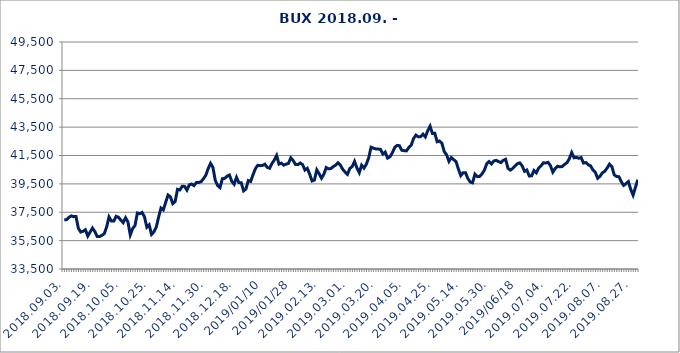
| Category | Series 0 |
|---|---|
| 2018.09.03. | 36971.856 |
| 2018.09.04. | 36968.107 |
| 2018.09.05. | 37135.328 |
| 2018.09.06. | 37241.816 |
| 2018.09.07. | 37189.976 |
| 2018.09.10. | 37202.889 |
| 2018.09.11. | 36371.943 |
| 2018.09.12. | 36104.073 |
| 2018.09.13. | 36156.035 |
| 2018.09.14. | 36269.166 |
| 2018.09.17. | 35819.9 |
| 2018.09.18. | 36110.885 |
| 2018.09.19. | 36386.403 |
| 2018.09.20. | 36134.329 |
| 2018.09.21. | 35783.48 |
| 2018.09.24. | 35786.545 |
| 2018.09.25. | 35868.88 |
| 2018.09.26. | 35996.041 |
| 2018.09.27. | 36471.348 |
| 2018.09.28. | 37171.414 |
| 2018.10.01. | 36883.492 |
| 2018.10.02. | 36876.748 |
| 2018.10.03. | 37212.945 |
| 2018.10.04. | 37146.727 |
| 2018.10.05. | 36945.25 |
| 2018.10.08. | 36768.023 |
| 2018.10.09. | 37109.241 |
| 2018.10.10. | 36821.117 |
| 2018.10.11. | 35904.542 |
| 2018.10.12. | 36347.89 |
| 2018.10.15. | 36564.15 |
| 2018.10.16. | 37445.673 |
| 2018.10.17. | 37399.11 |
| 2018.10.18. | 37485.015 |
| 2018.10.19. | 37185.929 |
| 2018.10.24. | 36452.736 |
| 2018.10.25. | 36617.542 |
| 2018.10.26. | 35937.614 |
| 2018.10.29. | 36110.122 |
| 2018.10.30. | 36444.725 |
| 2018.10.31. | 37155.206 |
| 2018.11.05. | 37794.87 |
| 2018.11.06. | 37666.001 |
| 2018.11.07. | 38197.997 |
| 2018.11.08. | 38713.446 |
| 2018.11.09. | 38586.627 |
| 2018.11.12. | 38108.455 |
| 2018.11.13. | 38252.647 |
| 2018.11.14. | 39115.558 |
| 2018.11.15. | 39070.967 |
| 2018.11.16. | 39328.386 |
| 2018.11.19. | 39323.012 |
| 2018.11.20. | 39058.304 |
| 2018.11.21. | 39431.33 |
| 2018.11.22. | 39489.376 |
| 2018.11.23. | 39379.776 |
| 2018.11.26. | 39598.286 |
| 2018.11.27. | 39601.698 |
| 2018.11.28. | 39656.246 |
| 2018.11.29. | 39861.634 |
| 2018.11.30. | 40109.366 |
| 2018.12.03. | 40579.822 |
| 2018.12.04. | 40945.474 |
| 2018.12.05. | 40670.445 |
| 2018.12.06. | 39747.127 |
| 2018.12.07. | 39384.556 |
| 2018.12.10. | 39238.436 |
| 2018.12.11. | 39860.234 |
| 2018.12.12. | 39887.22 |
| 2018.12.13. | 40041.705 |
| 2018.12.14. | 40125.722 |
| 2018.12.17. | 39675.759 |
| 2018.12.18. | 39475.607 |
| 2018.12.19. | 39966.192 |
| 2018.12.20. | 39592.675 |
| 2018.12.21. | 39578.632 |
| 2018.12.27. | 39006.517 |
| 2018.12.28. | 39138.949 |
| 2019.01.02 | 39734.064 |
| 2019.01.03 | 39672.597 |
| 2019.01.04 | 40145.177 |
| 2019.01.07 | 40569.468 |
| 2019.01.08 | 40809.819 |
| 2019.01.09 | 40784.268 |
| 2019.01.10 | 40795.505 |
| 2019.01.11 | 40886.064 |
| 2019.01.14 | 40667.654 |
| 2019.01.15 | 40600.26 |
| 2019.01.16 | 40933.043 |
| 2019.01.17 | 41180.049 |
| 2019.01.18 | 41503.905 |
| 2019.01.21 | 40893.713 |
| 2019.01.22 | 40963.712 |
| 2019.01.23 | 40818.686 |
| 2019.01.24 | 40890.939 |
| 2019.01.25 | 40944.824 |
| 2019.01.28 | 41332.315 |
| 2019.01.29 | 41146 |
| 2019.01.30 | 40862.967 |
| 2019.01.31 | 40855.561 |
| 2019.02.01. | 40973.34 |
| 2019.02.04. | 40856.968 |
| 2019.02.05. | 40474.394 |
| 2019.02.06. | 40597.263 |
| 2019.02.07. | 40173.726 |
| 2019.02.08. | 39704.61 |
| 2019.02.11. | 39769.479 |
| 2019.02.12. | 40488.09 |
| 2019.02.13. | 40221.18 |
| 2019.02.14. | 39898.653 |
| 2019.02.15. | 40179.836 |
| 2019.02.18. | 40653.387 |
| 2019.02.19. | 40560.444 |
| 2019.02.20. | 40582.832 |
| 2019.02.21. | 40721.477 |
| 2019.02.22. | 40814.595 |
| 2019.02.25. | 40987.946 |
| 2019.02.26. | 40819.081 |
| 2019.02.27. | 40525.284 |
| 2019.02.28. | 40333.039 |
| 2019.03.01. | 40170.655 |
| 2019.03.04. | 40593.477 |
| 2019.03.05. | 40718.497 |
| 2019.03.06. | 41086.897 |
| 2019.03.07. | 40625.302 |
| 2019.03.08. | 40288.437 |
| 2019.03.11. | 40819.551 |
| 2019.03.12. | 40612.503 |
| 2019.03.13. | 40887.578 |
| 2019.03.14. | 41335.024 |
| 2019.03.18. | 42085.013 |
| 2019.03.19. | 42014.162 |
| 2019.03.20. | 41964.35 |
| 2019.03.21. | 41955.752 |
| 2019.03.22. | 41931.67 |
| 2019.03.25. | 41605.172 |
| 2019.03.26. | 41740.966 |
| 2019.03.27. | 41316.196 |
| 2019.03.28. | 41413.909 |
| 2019.03.29. | 41683.78 |
| 2019.04.01. | 42057.333 |
| 2019.04.02. | 42213.346 |
| 2019.04.03. | 42193.967 |
| 2019.04.04. | 41870.438 |
| 2019.04.05. | 41841.921 |
| 2019.04.08. | 41826.902 |
| 2019.04.09. | 42063.939 |
| 2019.04.10. | 42225.867 |
| 2019.04.11. | 42693.515 |
| 2019.04.12. | 42940.74 |
| 2019.04.15. | 42815.922 |
| 2019.04.16. | 42826.299 |
| 2019.04.17. | 43004.506 |
| 2019.04.18. | 42810.106 |
| 2019.04.23. | 43245.434 |
| 2019.04.24. | 43563.383 |
| 2019.04.25. | 43053.87 |
| 2019.04.26. | 43064.395 |
| 2019.04.29. | 42469.842 |
| 2019.04.30. | 42520.113 |
| 2019.05.02. | 42366.822 |
| 2019.05.03. | 41775.362 |
| 2019.05.06. | 41547.348 |
| 2019.05.07. | 41084.566 |
| 2019.05.08. | 41350.332 |
| 2019.05.09. | 41207.462 |
| 2019.05.10. | 41068.206 |
| 2019.05.13. | 40537.85 |
| 2019.05.14. | 40084.639 |
| 2019.05.15. | 40291.354 |
| 2019.05.16. | 40288.281 |
| 2019.05.17. | 39877.816 |
| 2019.05.20. | 39630.707 |
| 2019.05.21. | 39575.984 |
| 2019.05.22. | 40184.851 |
| 2019.05.23. | 40010.724 |
| 2019.05.24. | 40022.617 |
| 2019.05.27. | 40207.91 |
| 2019.05.28. | 40466.853 |
| 2019.05.29. | 40916.417 |
| 2019.05.30. | 41075.874 |
| 2019.05.31. | 40904.115 |
| 2019.06.03 | 41114.306 |
| 2019.06.04 | 41157.018 |
| 2019.06.05 | 41073.621 |
| 2019.06.06 | 41000.038 |
| 2019.06.07 | 41159.574 |
| 2019.06.11 | 41234.66 |
| 2019.06.12 | 40592.319 |
| 2019.06.13 | 40469.802 |
| 2019.06.14 | 40588.176 |
| 2019.06.17 | 40764.495 |
| 2019.06.18 | 40922.407 |
| 2019.06.19 | 40980.241 |
| 2019.06.20 | 40774.518 |
| 2019.06.21 | 40387.214 |
| 2019.06.24 | 40475.093 |
| 2019.06.25 | 40061.951 |
| 2019.06.26 | 40064.921 |
| 2019.06.27 | 40440.51 |
| 2019.06.28 | 40279.313 |
| 2019.07.01. | 40618.076 |
| 2019.07.02. | 40767.118 |
| 2019.07.03. | 40985.185 |
| 2019.07.04. | 40972.916 |
| 2019.07.05. | 41016.647 |
| 2019.07.08. | 40777.084 |
| 2019.07.09. | 40327.449 |
| 2019.07.10. | 40577.793 |
| 2019.07.11. | 40739.423 |
| 2019.07.12. | 40699.692 |
| 2019.07.15. | 40725.399 |
| 2019.07.16. | 40878.783 |
| 2019.07.17. | 40990.895 |
| 2019.07.18. | 41282.464 |
| 2019.07.19. | 41707.259 |
| 2019.07.22. | 41338.015 |
| 2019.07.23. | 41367.219 |
| 2019.07.24. | 41303.37 |
| 2019.07.25. | 41353.622 |
| 2019.07.26. | 40965.481 |
| 2019.07.29. | 41006.442 |
| 2019.07.30. | 40843.781 |
| 2019.07.31. | 40767.602 |
| 2019.08.01. | 40474.269 |
| 2019.08.02. | 40309.612 |
| 2019.08.05. | 39896.309 |
| 2019.08.06. | 40037.387 |
| 2019.08.07. | 40283.521 |
| 2019.08.08. | 40389.377 |
| 2019.08.09. | 40615.424 |
| 2019.08.12. | 40891.991 |
| 2019.08.13. | 40722.358 |
| 2019.08.14. | 40137.225 |
| 2019.08.15. | 40018.668 |
| 2019.08.16. | 40005.898 |
| 2019.08.21. | 39648.209 |
| 2019.08.22. | 39394.712 |
| 2019.08.23. | 39519.583 |
| 2019.08.26. | 39661.467 |
| 2019.08.27. | 39107.942 |
| 2019.08.28. | 38706.562 |
| 2019.08.29. | 39264.477 |
| 2019.08.30. | 39794.118 |